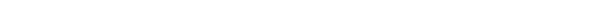
| Category | #REF! |
|---|---|
| 1.0 | 1 |